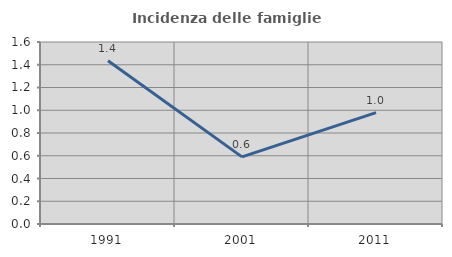
| Category | Incidenza delle famiglie numerose |
|---|---|
| 1991.0 | 1.435 |
| 2001.0 | 0.59 |
| 2011.0 | 0.979 |